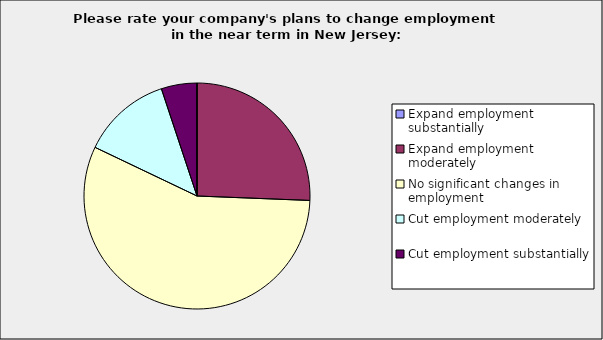
| Category | Series 0 |
|---|---|
| Expand employment substantially | 0 |
| Expand employment moderately | 0.256 |
| No significant changes in employment | 0.564 |
| Cut employment moderately | 0.128 |
| Cut employment substantially | 0.051 |